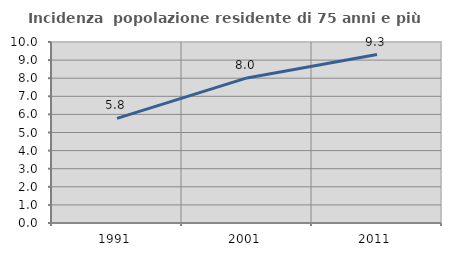
| Category | Incidenza  popolazione residente di 75 anni e più |
|---|---|
| 1991.0 | 5.778 |
| 2001.0 | 8.016 |
| 2011.0 | 9.307 |